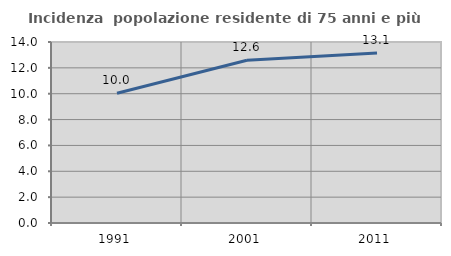
| Category | Incidenza  popolazione residente di 75 anni e più |
|---|---|
| 1991.0 | 10.036 |
| 2001.0 | 12.591 |
| 2011.0 | 13.146 |